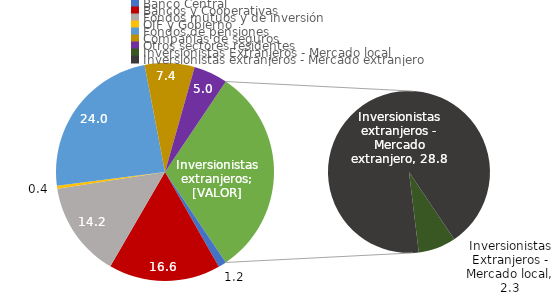
| Category | Series 0 |
|---|---|
| Banco Central | 1.204 |
| Bancos y Cooperativas | 16.586 |
| Fondos mutuos y de inversión | 14.191 |
| OIF y Gobierno | 0.421 |
| Fondos de pensiones | 24.027 |
| Compañias de seguros | 7.382 |
| Otros sectores residentes | 5.047 |
| Inversionistas Extranjeros - Mercado local | 2.335 |
| Inversionistas extranjeros - Mercado extranjero | 28.806 |